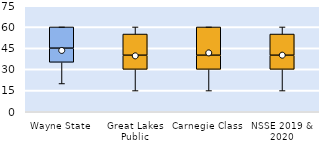
| Category | 25th | 50th | 75th |
|---|---|---|---|
| Wayne State | 35 | 10 | 15 |
| Great Lakes Public | 30 | 10 | 15 |
| Carnegie Class | 30 | 10 | 20 |
| NSSE 2019 & 2020 | 30 | 10 | 15 |